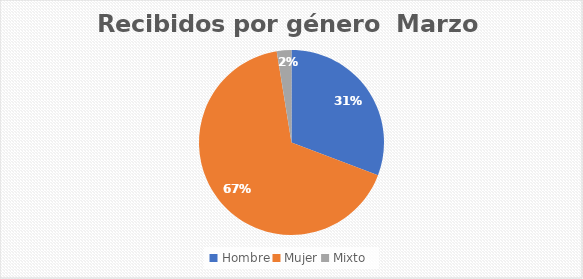
| Category | Recibidos por género  Marzo |
|---|---|
| Hombre | 12 |
| Mujer | 26 |
| Mixto | 1 |